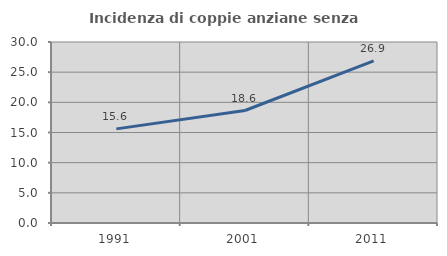
| Category | Incidenza di coppie anziane senza figli  |
|---|---|
| 1991.0 | 15.603 |
| 2001.0 | 18.644 |
| 2011.0 | 26.882 |